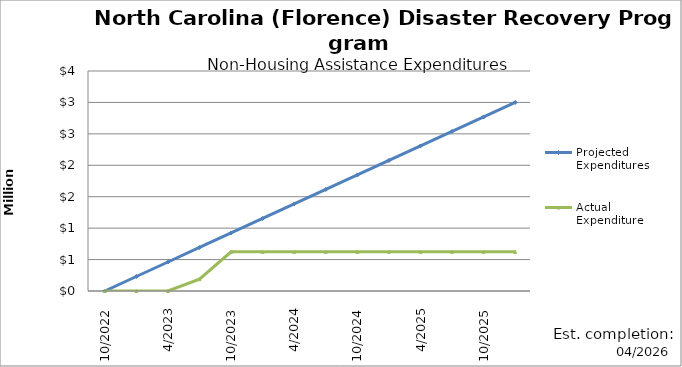
| Category | Projected Expenditures | Actual Expenditure |
|---|---|---|
| 10/2022 | 0 | 0 |
| 1/2023 | 230770 | 0 |
| 4/2023 | 461540 | 0 |
| 7/2023 | 692310 | 188876.09 |
| 10/2023 | 923080 | 622600.09 |
| 1/2024 | 1153850 | 622600.09 |
| 4/2024 | 1384620 | 622600.09 |
| 7/2024 | 1615390 | 622600.09 |
| 10/2024 | 1846160 | 622600.09 |
| 1/2025 | 2076930 | 622600.09 |
| 4/2025 | 2307700 | 622600.09 |
| 7/2025 | 2538470 | 622600.09 |
| 10/2025 | 2769230 | 622600.09 |
| 1/2026 | 3000000 | 622600.09 |